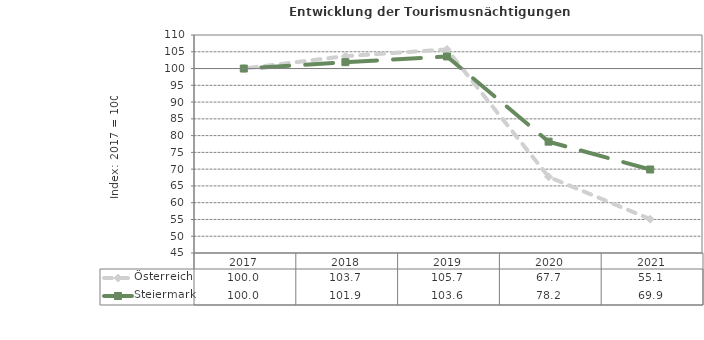
| Category | Österreich | Steiermark |
|---|---|---|
| 2021.0 | 55.1 | 69.9 |
| 2020.0 | 67.7 | 78.2 |
| 2019.0 | 105.7 | 103.6 |
| 2018.0 | 103.7 | 101.9 |
| 2017.0 | 100 | 100 |